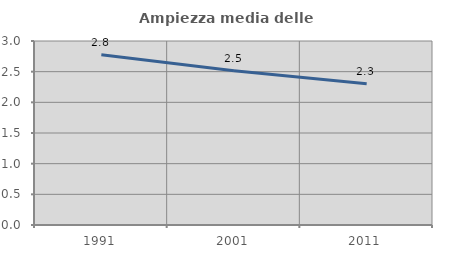
| Category | Ampiezza media delle famiglie |
|---|---|
| 1991.0 | 2.775 |
| 2001.0 | 2.515 |
| 2011.0 | 2.301 |